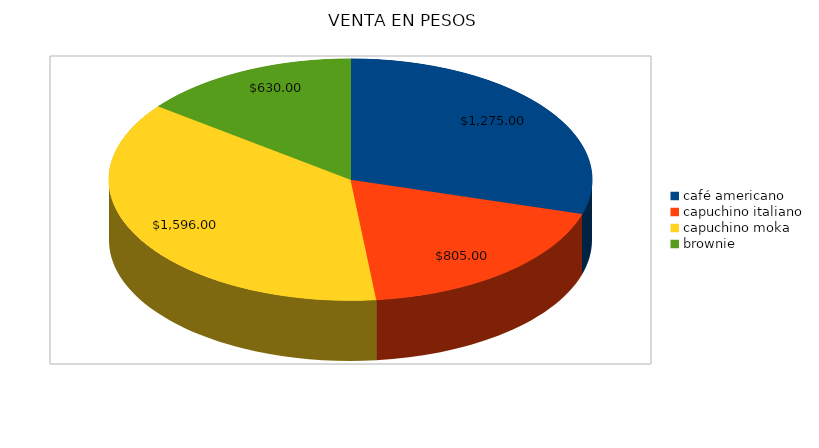
| Category | Series 0 |
|---|---|
| café americano | 1275 |
| capuchino italiano  | 805 |
| capuchino moka | 1596 |
| brownie  | 630 |